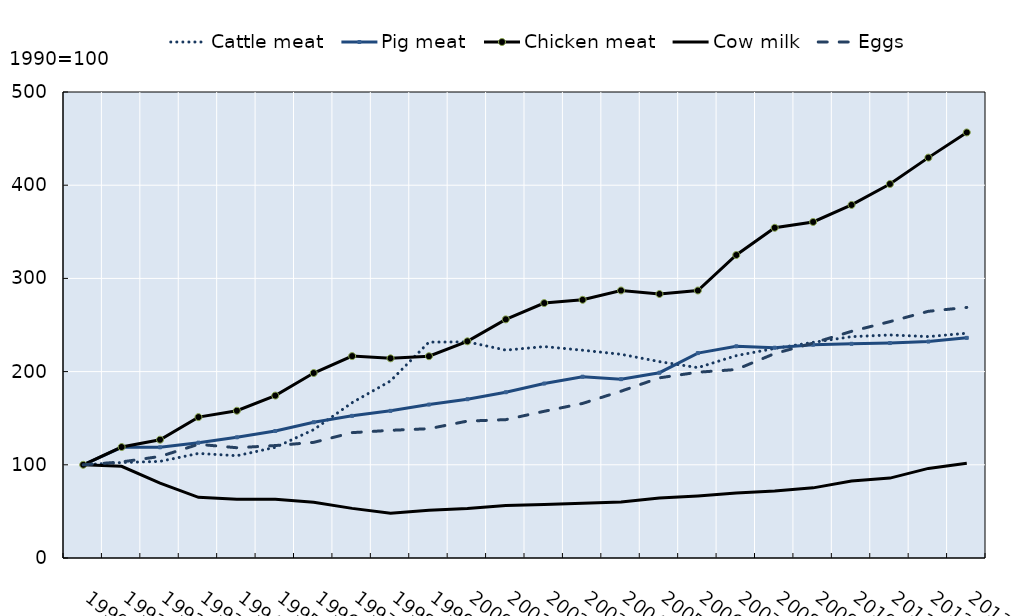
| Category | Cattle meat | Pig meat | Chicken meat | Cow milk | Eggs |
|---|---|---|---|---|---|
| 1990.0 | 100 | 100 | 100 | 100 | 100 |
| 1991.0 | 102.439 | 118.75 | 119.07 | 98.437 | 103.084 |
| 1992.0 | 103.659 | 118.755 | 126.921 | 80.354 | 108.944 |
| 1993.0 | 112.195 | 123.77 | 151.171 | 65.138 | 121.967 |
| 1994.0 | 109.756 | 129.504 | 158.005 | 63.054 | 118.31 |
| 1995.0 | 118.732 | 136.263 | 174.268 | 63.106 | 120.646 |
| 1996.0 | 137.684 | 145.627 | 198.492 | 59.927 | 124.074 |
| 1997.0 | 166.629 | 152.515 | 216.631 | 53.257 | 134.502 |
| 1998.0 | 190 | 157.887 | 214.252 | 48.15 | 136.995 |
| 1999.0 | 231.627 | 164.628 | 216.519 | 51.329 | 138.733 |
| 2000.0 | 231.901 | 170.357 | 232.521 | 53.205 | 146.883 |
| 2001.0 | 223.032 | 177.853 | 256.051 | 56.279 | 148.461 |
| 2002.0 | 226.829 | 187.19 | 273.514 | 57.322 | 157.411 |
| 2003.0 | 222.943 | 194.528 | 277.015 | 58.624 | 165.851 |
| 2004.0 | 218.572 | 191.863 | 287.043 | 60.188 | 178.983 |
| 2005.0 | 210.682 | 198.809 | 283.283 | 64.304 | 193.313 |
| 2006.0 | 204.238 | 219.871 | 287.008 | 66.649 | 199.33 |
| 2007.0 | 217.123 | 227.143 | 325.107 | 69.828 | 202.233 |
| 2008.0 | 224.833 | 225.636 | 354.298 | 71.965 | 219.369 |
| 2009.0 | 231.35 | 228.847 | 360.558 | 75.263 | 230.603 |
| 2010.0 | 237.505 | 229.818 | 378.836 | 82.673 | 243.196 |
| 2011.0 | 239.309 | 230.638 | 401.288 | 85.748 | 253.618 |
| 2012.0 | 237.573 | 232.224 | 429.601 | 96.128 | 264.695 |
| 2013.0 | 241.167 | 236.193 | 456.622 | 101.772 | 268.865 |